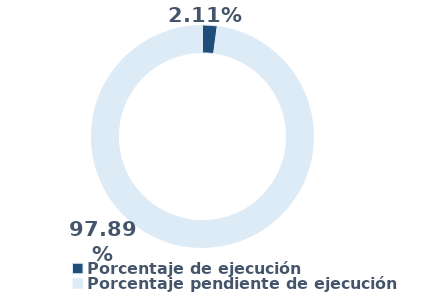
| Category | Series 0 |
|---|---|
| Porcentaje de ejecución | 0.021 |
| Porcentaje pendiente de ejecución | 0.979 |